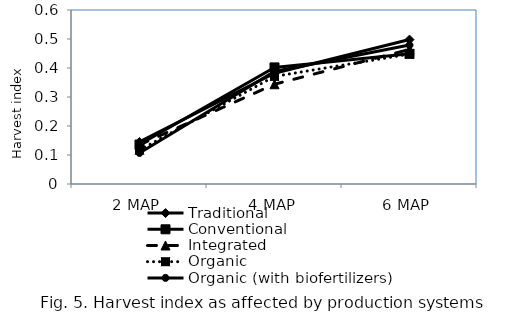
| Category | Traditional | Conventional | Integrated | Organic  | Organic (with biofertilizers) |
|---|---|---|---|---|---|
| 2 MAP | 0.145 | 0.136 | 0.135 | 0.117 | 0.107 |
| 4 MAP | 0.382 | 0.402 | 0.344 | 0.371 | 0.388 |
| 6 MAP | 0.498 | 0.449 | 0.464 | 0.448 | 0.479 |